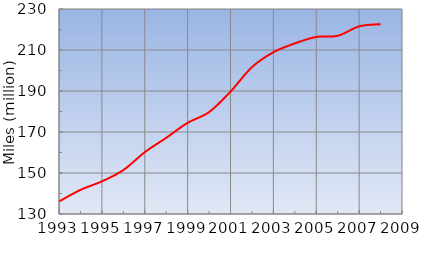
| Category | Toll VMT (million) |
|---|---|
| 1993.0 | 136.098 |
| 1994.0 | 141.743 |
| 1995.0 | 145.915 |
| 1996.0 | 151.401 |
| 1997.0 | 160.142 |
| 1998.0 | 167.155 |
| 1999.0 | 174.473 |
| 2000.0 | 179.683 |
| 2001.0 | 189.7 |
| 2002.0 | 201.642 |
| 2003.0 | 208.9 |
| 2004.0 | 213.213 |
| 2005.0 | 216.385 |
| 2006.0 | 216.926 |
| 2007.0 | 221.528 |
| 2008.0 | 222.624 |